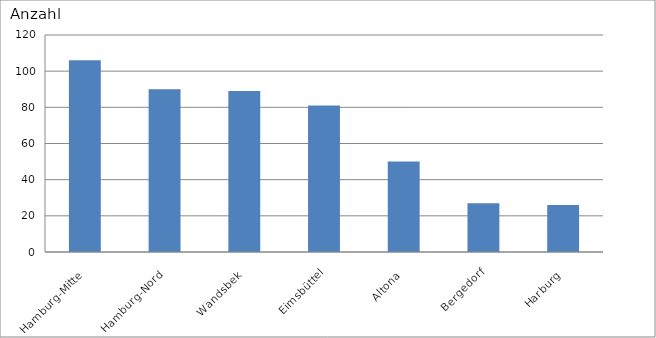
| Category | Hamburg-Mitte |
|---|---|
| Hamburg-Mitte | 106 |
| Hamburg-Nord | 90 |
| Wandsbek | 89 |
| Eimsbüttel | 81 |
| Altona | 50 |
| Bergedorf | 27 |
| Harburg | 26 |